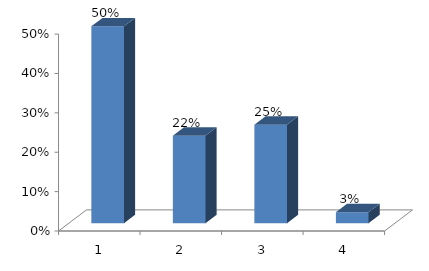
| Category | Series 0 |
|---|---|
| 0 | 0.5 |
| 1 | 0.222 |
| 2 | 0.25 |
| 3 | 0.028 |